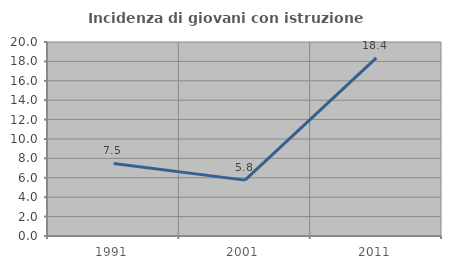
| Category | Incidenza di giovani con istruzione universitaria |
|---|---|
| 1991.0 | 7.477 |
| 2001.0 | 5.761 |
| 2011.0 | 18.359 |